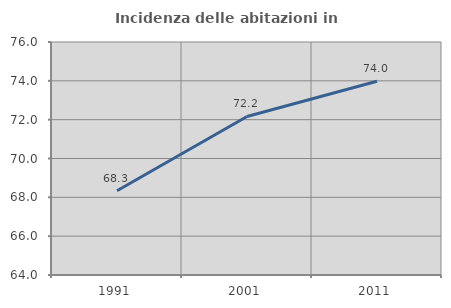
| Category | Incidenza delle abitazioni in proprietà  |
|---|---|
| 1991.0 | 68.342 |
| 2001.0 | 72.164 |
| 2011.0 | 73.978 |